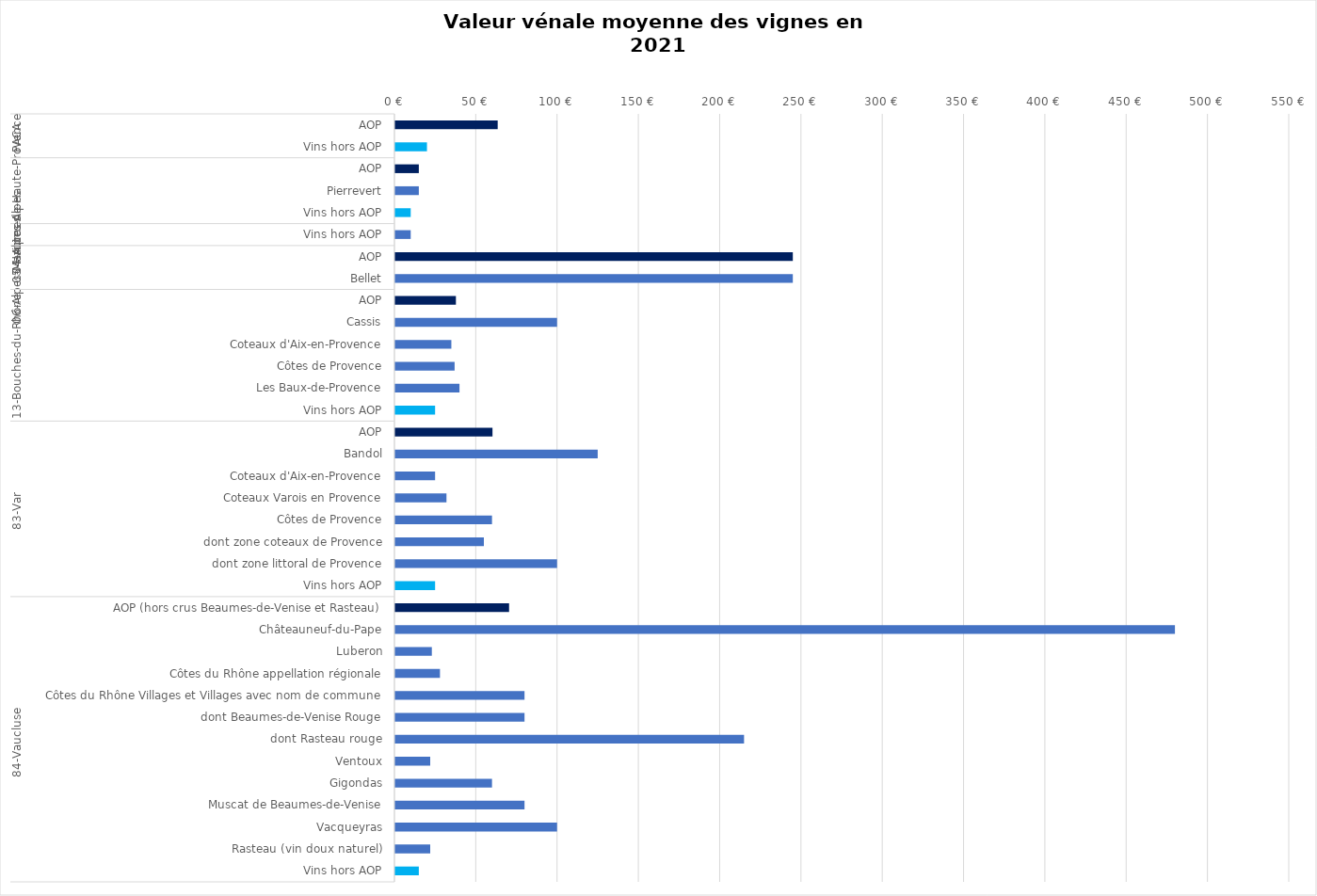
| Category | Series 4 |
|---|---|
| 0 | 63.5 |
| 1 | 20 |
| 2 | 15 |
| 3 | 15 |
| 4 | 10 |
| 5 | 10 |
| 6 | 245 |
| 7 | 245 |
| 8 | 37.8 |
| 9 | 100 |
| 10 | 35 |
| 11 | 37 |
| 12 | 40 |
| 13 | 25 |
| 14 | 60.3 |
| 15 | 125 |
| 16 | 25 |
| 17 | 32 |
| 18 | 60 |
| 19 | 55 |
| 20 | 100 |
| 21 | 25 |
| 22 | 70.5 |
| 23 | 480 |
| 24 | 23 |
| 25 | 28 |
| 26 | 80 |
| 27 | 80 |
| 28 | 215 |
| 29 | 22 |
| 30 | 60 |
| 31 | 80 |
| 32 | 100 |
| 33 | 22 |
| 34 | 15 |